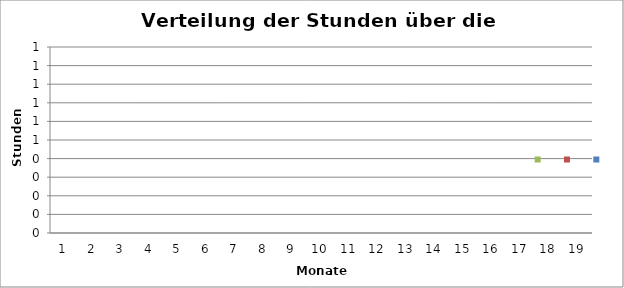
| Category | Series 3 | Series 2 | Series 1 |
|---|---|---|---|
| 0 | 0 | 0 | 0 |
| 1 | 0 | 0 | 0 |
| 2 | 0 | 0 | 0 |
| 3 | 0 | 0 | 0 |
| 4 | 0 | 0 | 0 |
| 5 | 0 | 0 | 0 |
| 6 | 0 | 0 | 0 |
| 7 | 0 | 0 | 0 |
| 8 | 0 | 0 | 0 |
| 9 | 0 | 0 | 0 |
| 10 | 0 | 0 | 0 |
| 11 | 0 | 0 | 0 |
| 12 | 0 | 0 | 0 |
| 13 | 0 | 0 | 0 |
| 14 | 0 | 0 | 0 |
| 15 | 0 | 0 | 0 |
| 16 | 0 | 0 | 0 |
| 17 | 0 | 0 | 0 |
| 18 | 0 | 0 | 0 |